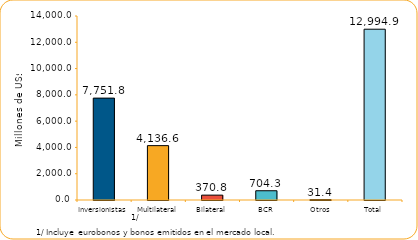
| Category | Series 1 |
|---|---|
| Inversionistas | 7751.8 |
| Multilateral | 4136.6 |
| Bilateral | 370.8 |
| BCR | 704.3 |
| Otros | 31.4 |
| Total | 12994.9 |